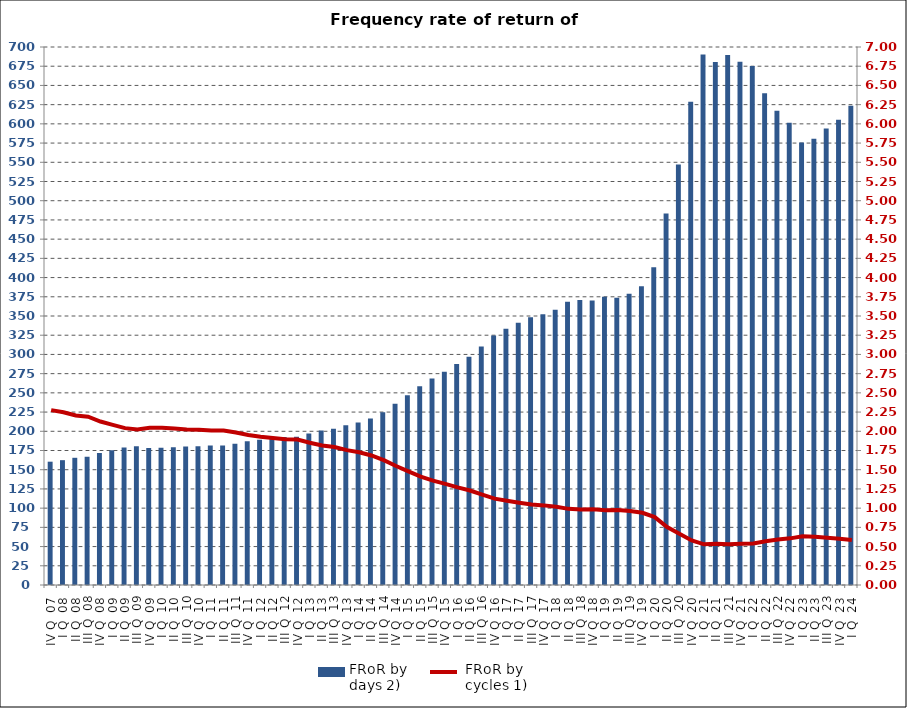
| Category | FRoR by 
days 2) |
|---|---|
| IV Q  07 | 160.443 |
| I Q  08 | 162.423 |
| II Q  08 | 165.508 |
| III Q  08 | 166.729 |
| IV Q  08 | 171.616 |
| I Q  09 | 175.195 |
| II Q  09 | 178.848 |
| III Q  09 | 180.45 |
| IV Q  09 | 178.398 |
| I Q  10 | 178.499 |
| II Q  10 | 179.325 |
| III Q  10 | 180.353 |
| IV Q  10 | 180.662 |
| I Q  11 | 181.471 |
| II Q  11 | 181.514 |
| III Q  11 | 183.939 |
| IV Q  11 | 187.056 |
| I Q  12 | 189.128 |
| II Q  12 | 190.848 |
| III Q  12 | 192.539 |
| IV Q  12 | 192.887 |
| I Q  13 | 197.176 |
| II Q  13 | 201.108 |
| III Q  13 | 203.32 |
| IV Q  13 | 207.966 |
| I Q  14 | 211.326 |
| II Q  14 | 216.525 |
| III Q  14 | 224.77 |
| IV Q  14 | 235.711 |
| I Q  15 | 246.759 |
| II Q  15 | 258.716 |
| III Q  15 | 268.774 |
| IV Q  15 | 277.554 |
| I Q  16 | 287.536 |
| II Q  16 | 296.832 |
| III Q  16 | 310.258 |
| IV Q  16 | 324.783 |
| I Q  17 | 333.313 |
| II Q  17 | 341.207 |
| III Q  17 | 348.468 |
| IV Q  17 | 352.357 |
| I Q  18 | 358.186 |
| II Q  18 | 368.473 |
| III Q  18 | 370.971 |
| IV Q  18 | 370.316 |
| I Q  19 | 374.943 |
| II Q  19 | 373.6 |
| III Q  19 | 378.861 |
| IV Q  19 | 388.626 |
| I Q  20 | 413.333 |
| II Q  20 | 483.526 |
| III Q  20 | 547.045 |
| IV Q  20 | 628.823 |
| I Q  21 | 690.259 |
| II Q  21 | 680.326 |
| III Q  21 | 689.541 |
| IV Q  21 | 680.947 |
| I Q  22 | 675.439 |
| II Q  22 | 639.968 |
| III Q  22 | 616.896 |
| IV Q  22 | 601.551 |
| I Q  23 | 575.796 |
| II Q  23 | 580.742 |
| III Q  23 | 593.879 |
| IV Q  23 | 605.387 |
| I Q  24 | 623.503 |